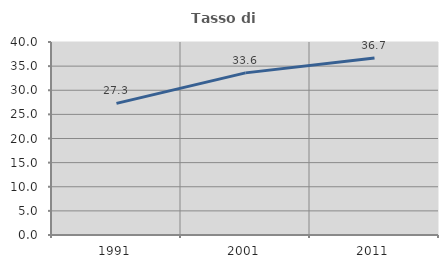
| Category | Tasso di occupazione   |
|---|---|
| 1991.0 | 27.273 |
| 2001.0 | 33.602 |
| 2011.0 | 36.68 |